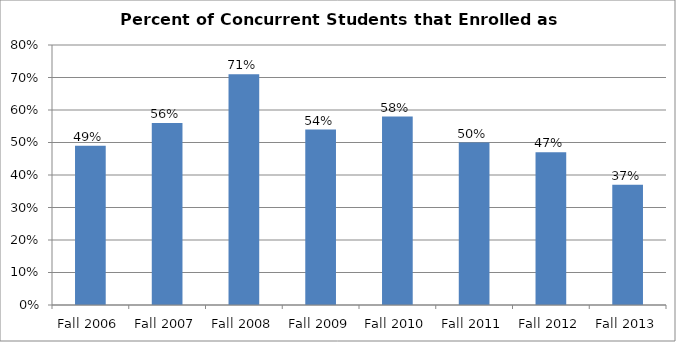
| Category | Series 0 |
|---|---|
| Fall 2006 | 0.49 |
| Fall 2007 | 0.56 |
| Fall 2008 | 0.71 |
| Fall 2009 | 0.54 |
| Fall 2010 | 0.58 |
| Fall 2011 | 0.5 |
| Fall 2012 | 0.47 |
| Fall 2013 | 0.37 |